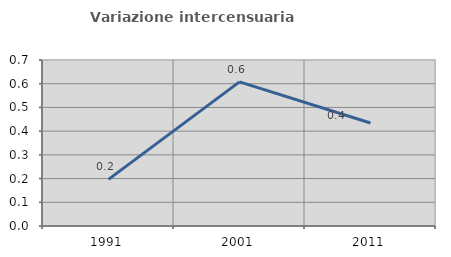
| Category | Variazione intercensuaria annua |
|---|---|
| 1991.0 | 0.197 |
| 2001.0 | 0.608 |
| 2011.0 | 0.435 |